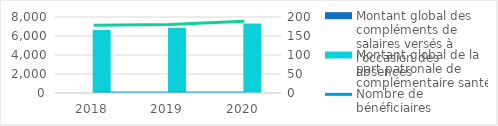
| Category | Montant global des compléments de salaires versés à l'occasion des absences | Montant global de la part patronale de complémentaire santé |
|---|---|---|
| 2018.0 | 0 | 6640.28 |
| 2019.0 | 0 | 6868.8 |
| 2020.0 | 0 | 7321.86 |